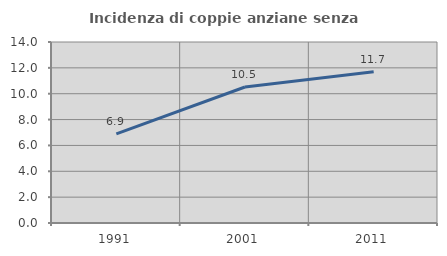
| Category | Incidenza di coppie anziane senza figli  |
|---|---|
| 1991.0 | 6.891 |
| 2001.0 | 10.522 |
| 2011.0 | 11.706 |